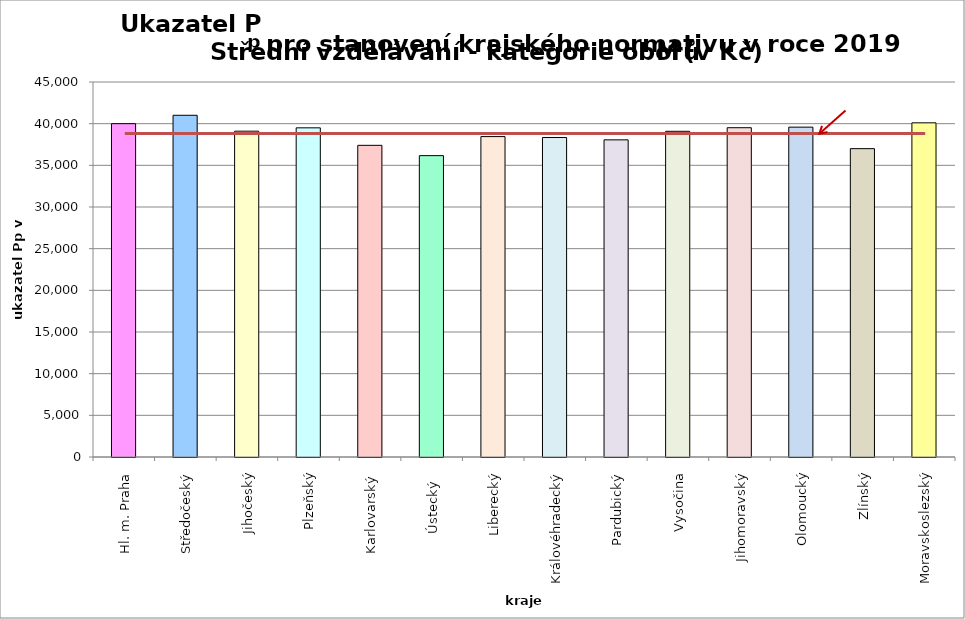
| Category | Series 0 |
|---|---|
| Hl. m. Praha | 40000 |
| Středočeský | 41008 |
| Jihočeský | 39099 |
| Plzeňský | 39500 |
| Karlovarský  | 37400 |
| Ústecký   | 36165 |
| Liberecký | 38450 |
| Královéhradecký | 38338 |
| Pardubický | 38058 |
| Vysočina | 39084 |
| Jihomoravský | 39514 |
| Olomoucký | 39583 |
| Zlínský | 37003 |
| Moravskoslezský | 40100 |